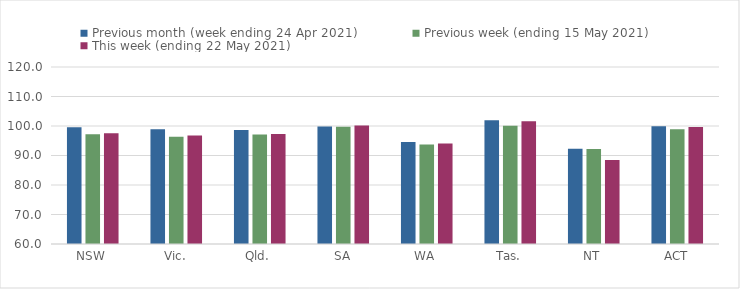
| Category | Previous month (week ending 24 Apr 2021) | Previous week (ending 15 May 2021) | This week (ending 22 May 2021) |
|---|---|---|---|
| NSW | 99.59 | 97.18 | 97.51 |
| Vic. | 98.88 | 96.38 | 96.76 |
| Qld. | 98.65 | 97.12 | 97.25 |
| SA | 99.83 | 99.71 | 100.18 |
| WA | 94.54 | 93.73 | 94.05 |
| Tas. | 101.94 | 100.06 | 101.64 |
| NT | 92.29 | 92.17 | 88.45 |
| ACT | 99.94 | 98.91 | 99.64 |